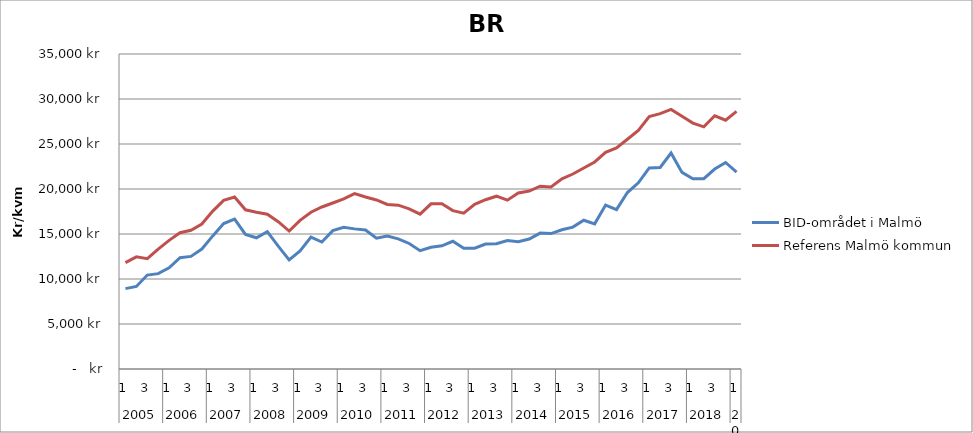
| Category | BID-området i Malmö | Referens Malmö kommun |
|---|---|---|
| 0 | 8932.839 | 11819.039 |
| 1 | 9168.062 | 12463.844 |
| 2 | 10434.734 | 12252.94 |
| 3 | 10597.541 | 13312.122 |
| 4 | 11240.924 | 14294.537 |
| 5 | 12373.551 | 15141.292 |
| 6 | 12512.831 | 15412.157 |
| 7 | 13326.6 | 16108.531 |
| 8 | 14787.578 | 17546.245 |
| 9 | 16157.477 | 18733.259 |
| 10 | 16663.473 | 19114.501 |
| 11 | 14948.507 | 17685.912 |
| 12 | 14581.468 | 17425.419 |
| 13 | 15264.848 | 17200.269 |
| 14 | 13644.396 | 16363.265 |
| 15 | 12128.836 | 15329.078 |
| 16 | 13128.143 | 16521.049 |
| 17 | 14659.691 | 17424.867 |
| 18 | 14109.685 | 18000.251 |
| 19 | 15372.663 | 18444.653 |
| 20 | 15742.036 | 18902.092 |
| 21 | 15568.61 | 19479.615 |
| 22 | 15447.788 | 19112.607 |
| 23 | 14535.018 | 18780.836 |
| 24 | 14770.263 | 18280.404 |
| 25 | 14460.27 | 18204.01 |
| 26 | 13946.452 | 17793.431 |
| 27 | 13145.293 | 17202.258 |
| 28 | 13533.269 | 18354.302 |
| 29 | 13688.183 | 18357.848 |
| 30 | 14191.029 | 17601.665 |
| 31 | 13406.405 | 17308.257 |
| 32 | 13429.803 | 18294.959 |
| 33 | 13885.542 | 18806.957 |
| 34 | 13924.31 | 19198.84 |
| 35 | 14264.842 | 18758.317 |
| 36 | 14137.191 | 19556.088 |
| 37 | 14444.5 | 19772.193 |
| 38 | 15101.985 | 20312.836 |
| 39 | 15048.365 | 20234.008 |
| 40 | 15465.506 | 21133.176 |
| 41 | 15765.089 | 21664.346 |
| 42 | 16529.833 | 22333.62 |
| 43 | 16129.44 | 23002.459 |
| 44 | 18216.371 | 24067.172 |
| 45 | 17713.874 | 24571.124 |
| 46 | 19606.747 | 25533.078 |
| 47 | 20690.478 | 26512.718 |
| 48 | 22336.699 | 28053.027 |
| 49 | 22393 | 28367.218 |
| 50 | 23993.663 | 28840.634 |
| 51 | 21845.167 | 28074.406 |
| 52 | 21142.544 | 27324.856 |
| 53 | 21143.093 | 26907.413 |
| 54 | 22218.853 | 28140.266 |
| 55 | 22945.128 | 27644.882 |
| 56 | 21879.653 | 28633.549 |